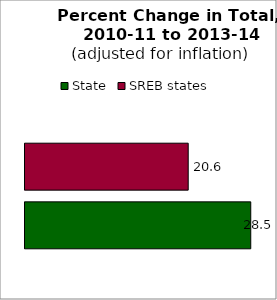
| Category | State | SREB states |
|---|---|---|
| 0 | 28.457 | 20.572 |